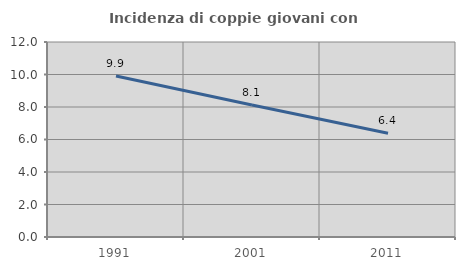
| Category | Incidenza di coppie giovani con figli |
|---|---|
| 1991.0 | 9.905 |
| 2001.0 | 8.119 |
| 2011.0 | 6.39 |